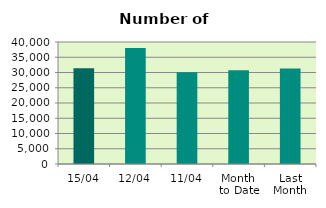
| Category | Series 0 |
|---|---|
| 15/04 | 31366 |
| 12/04 | 38004 |
| 11/04 | 30048 |
| Month 
to Date | 30710.727 |
| Last
Month | 31344.095 |